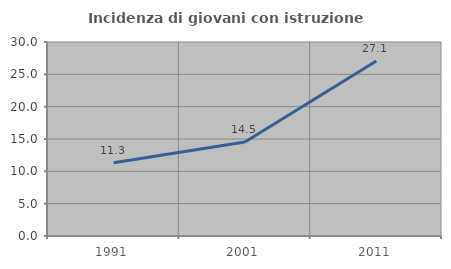
| Category | Incidenza di giovani con istruzione universitaria |
|---|---|
| 1991.0 | 11.331 |
| 2001.0 | 14.525 |
| 2011.0 | 27.059 |